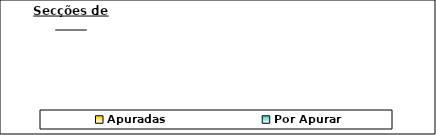
| Category | Series 0 |
|---|---|
| Apuradas | 0 |
| Por Apurar | 0 |